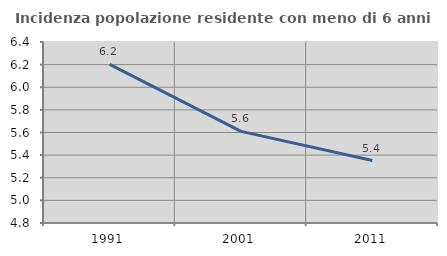
| Category | Incidenza popolazione residente con meno di 6 anni |
|---|---|
| 1991.0 | 6.202 |
| 2001.0 | 5.61 |
| 2011.0 | 5.352 |